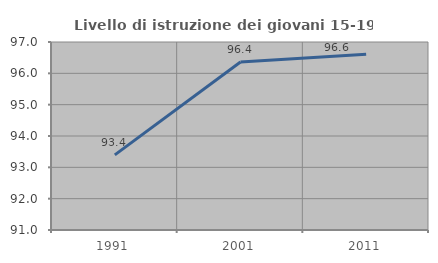
| Category | Livello di istruzione dei giovani 15-19 anni |
|---|---|
| 1991.0 | 93.396 |
| 2001.0 | 96.364 |
| 2011.0 | 96.61 |